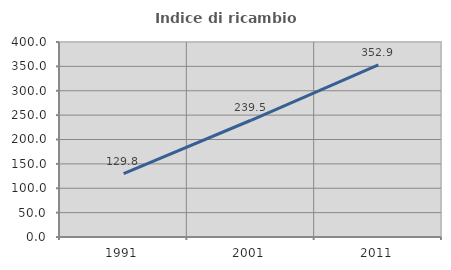
| Category | Indice di ricambio occupazionale  |
|---|---|
| 1991.0 | 129.825 |
| 2001.0 | 239.474 |
| 2011.0 | 352.941 |